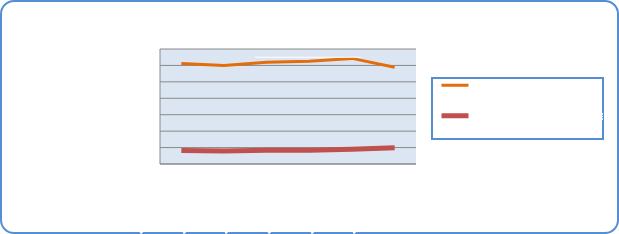
| Category | Motorin Türleri | Benzin Türleri |
|---|---|---|
| 10/7/19 | 61205826.767 | 8188241.947 |
| 10/8/19 | 60014195.457 | 7901453.174 |
| 10/9/19 | 61883276.366 | 8302010.75 |
| 10/10/19 | 62609635.02 | 8408691.193 |
| 10/11/19 | 64282668.596 | 9039753.694 |
| 10/12/19 | 58836906.136 | 9899137.118 |